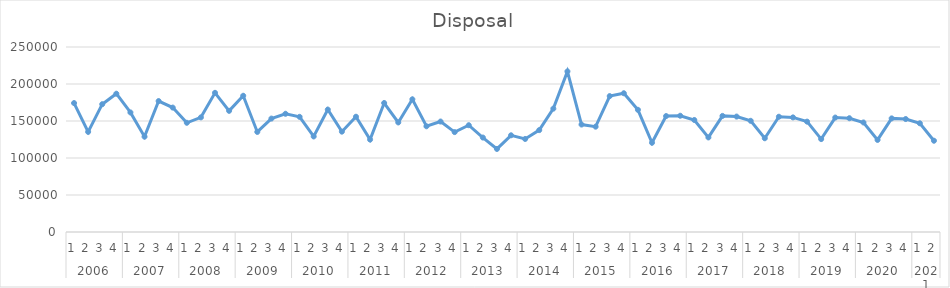
| Category | Disposal |
|---|---|
| 0 | 174236 |
| 1 | 135310 |
| 2 | 172715 |
| 3 | 186870 |
| 4 | 161562 |
| 5 | 128822 |
| 6 | 176932 |
| 7 | 168127 |
| 8 | 147586 |
| 9 | 154907 |
| 10 | 188075 |
| 11 | 163713 |
| 12 | 184102 |
| 13 | 135242 |
| 14 | 153258 |
| 15 | 159768 |
| 16 | 155633 |
| 17 | 129137 |
| 18 | 165453 |
| 19 | 135595 |
| 20 | 155775 |
| 21 | 124875 |
| 22 | 174309 |
| 23 | 148059 |
| 24 | 179308 |
| 25 | 142856 |
| 26 | 149270 |
| 27 | 135013 |
| 28 | 144321 |
| 29 | 127639 |
| 30 | 112238 |
| 31 | 130669 |
| 32 | 125741 |
| 33 | 137674 |
| 34 | 166694 |
| 35 | 217021 |
| 36 | 145210 |
| 37 | 142335 |
| 38 | 183662 |
| 39 | 187506 |
| 40 | 165135 |
| 41 | 120623 |
| 42 | 156667 |
| 43 | 157099.307 |
| 44 | 151362.862 |
| 45 | 127800.225 |
| 46 | 156877.771 |
| 47 | 155983.89 |
| 48 | 150247.445 |
| 49 | 126684.808 |
| 50 | 155762.354 |
| 51 | 154868.473 |
| 52 | 149132.028 |
| 53 | 125569.392 |
| 54 | 154646.937 |
| 55 | 153753.056 |
| 56 | 148016.611 |
| 57 | 124453.975 |
| 58 | 153531.52 |
| 59 | 152637.639 |
| 60 | 146901.194 |
| 61 | 123338.558 |